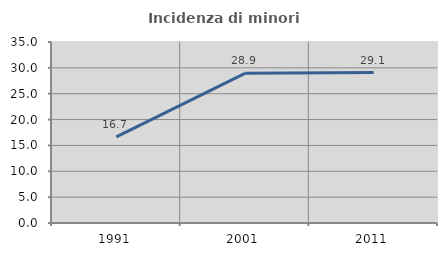
| Category | Incidenza di minori stranieri |
|---|---|
| 1991.0 | 16.667 |
| 2001.0 | 28.947 |
| 2011.0 | 29.091 |